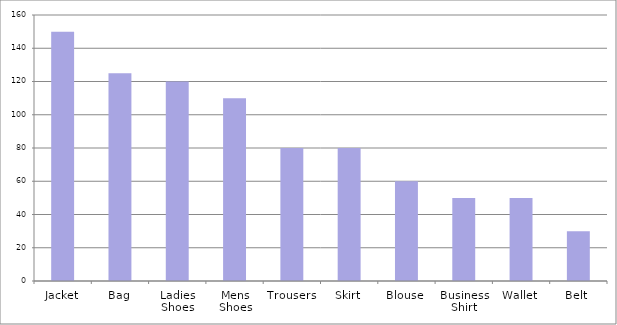
| Category | List Price |
|---|---|
| Jacket | 150 |
| Bag | 125 |
| Ladies Shoes | 120 |
| Mens Shoes | 110 |
| Trousers | 80 |
| Skirt | 80 |
| Blouse | 60 |
| Business Shirt | 50 |
| Wallet | 50 |
| Belt | 30 |